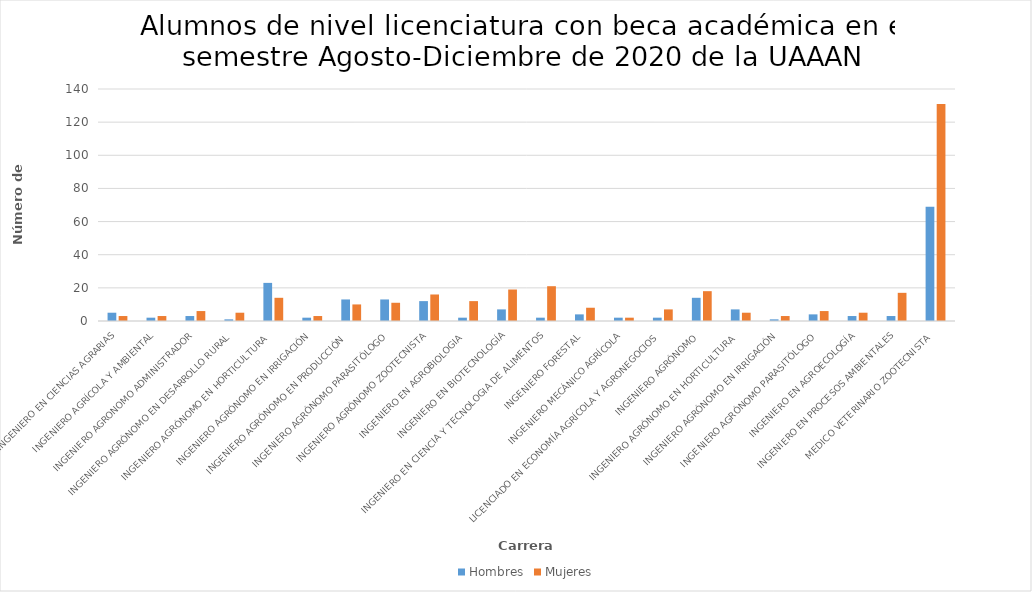
| Category | Hombres | Mujeres |
|---|---|---|
| INGENIERO EN CIENCIAS AGRARIAS | 5 | 3 |
| INGENIERO AGRÍCOLA Y AMBIENTAL | 2 | 3 |
| INGENIERO AGRONOMO ADMINISTRADOR | 3 | 6 |
| INGENIERO AGRÓNOMO EN DESARROLLO RURAL | 1 | 5 |
| INGENIERO AGRÓNOMO EN HORTICULTURA | 23 | 14 |
| INGENIERO AGRÓNOMO EN IRRIGACIÓN | 2 | 3 |
| INGENIERO AGRÓNOMO EN PRODUCCIÓN | 13 | 10 |
| INGENIERO AGRÓNOMO PARASITÓLOGO | 13 | 11 |
| INGENIERO AGRÓNOMO ZOOTECNISTA | 12 | 16 |
| INGENIERO EN AGROBIOLOGIA | 2 | 12 |
| INGENIERO EN BIOTECNOLOGÍA | 7 | 19 |
| INGENIERO EN CIENCIA Y TECNOLOGIA DE ALIMENTOS | 2 | 21 |
| INGENIERO FORESTAL | 4 | 8 |
| INGENIERO MECÁNICO AGRÍCOLA | 2 | 2 |
| LICENCIADO EN ECONOMÍA AGRÍCOLA Y AGRONEGOCIOS | 2 | 7 |
| INGENIERO AGRÓNOMO | 14 | 18 |
| INGENIERO AGRÓNOMO EN HORTICULTURA | 7 | 5 |
| INGENIERO AGRÓNOMO EN IRRIGACIÓN | 1 | 3 |
| INGENIERO AGRÓNOMO PARASITÓLOGO | 4 | 6 |
| INGENIERO EN AGROECOLOGÍA | 3 | 5 |
| INGENIERO EN PROCESOS AMBIENTALES | 3 | 17 |
| MEDICO VETERINARIO ZOOTECNISTA | 69 | 131 |